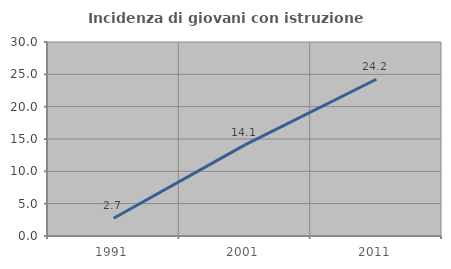
| Category | Incidenza di giovani con istruzione universitaria |
|---|---|
| 1991.0 | 2.736 |
| 2001.0 | 14.098 |
| 2011.0 | 24.242 |